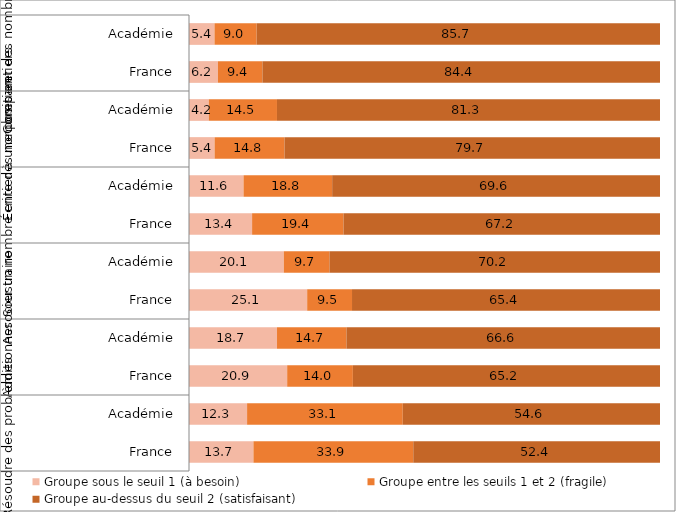
| Category | Groupe sous le seuil 1 (à besoin) | Groupe entre les seuils 1 et 2 (fragile) | Groupe au-dessus du seuil 2 (satisfaisant) |
|---|---|---|---|
| 0 | 13.683 | 33.933 | 52.383 |
| 1 | 12.333 | 33.05 | 54.617 |
| 2 | 20.85 | 13.95 | 65.217 |
| 3 | 18.683 | 14.733 | 66.567 |
| 4 | 25.083 | 9.517 | 65.367 |
| 5 | 20.133 | 9.683 | 70.183 |
| 6 | 13.4 | 19.4 | 67.217 |
| 7 | 11.583 | 18.817 | 69.617 |
| 8 | 5.433 | 14.833 | 79.717 |
| 9 | 4.2 | 14.483 | 81.333 |
| 10 | 6.15 | 9.433 | 84.4 |
| 11 | 5.417 | 8.95 | 85.65 |